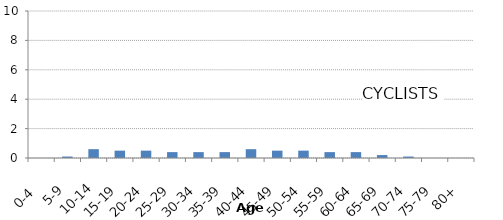
| Category | CYCLISTS |
|---|---|
| 0-4  | 0 |
| 5-9 | 0.1 |
| 10-14 | 0.6 |
| 15-19  | 0.5 |
| 20-24  | 0.5 |
| 25-29  | 0.4 |
| 30-34  | 0.4 |
| 35-39  | 0.4 |
| 40-44  | 0.6 |
| 45-49  | 0.5 |
| 50-54  | 0.5 |
| 55-59  | 0.4 |
| 60-64  | 0.4 |
| 65-69  | 0.2 |
| 70-74  | 0.1 |
| 75-79  | 0 |
| 80+ | 0 |